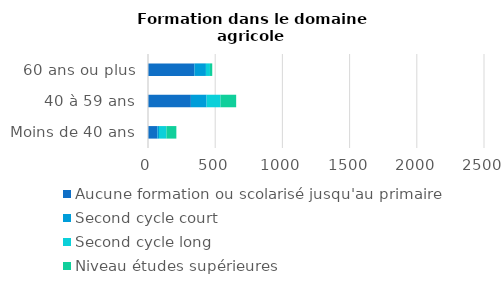
| Category | Aucune formation ou scolarisé jusqu'au primaire | Second cycle court | Second cycle long | Niveau études supérieures |
|---|---|---|---|---|
| Moins de 40 ans | 70 | 12 | 55 | 74 |
| 40 à 59 ans | 319 | 117 | 103 | 117 |
| 60 ans ou plus | 345 | 86 | 30 | 17 |